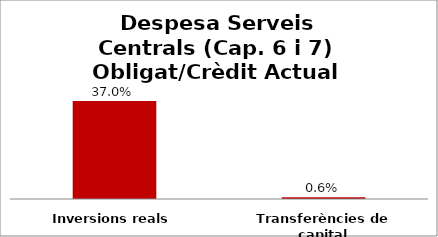
| Category | Series 0 |
|---|---|
| Inversions reals | 0.37 |
| Transferències de capital | 0.006 |